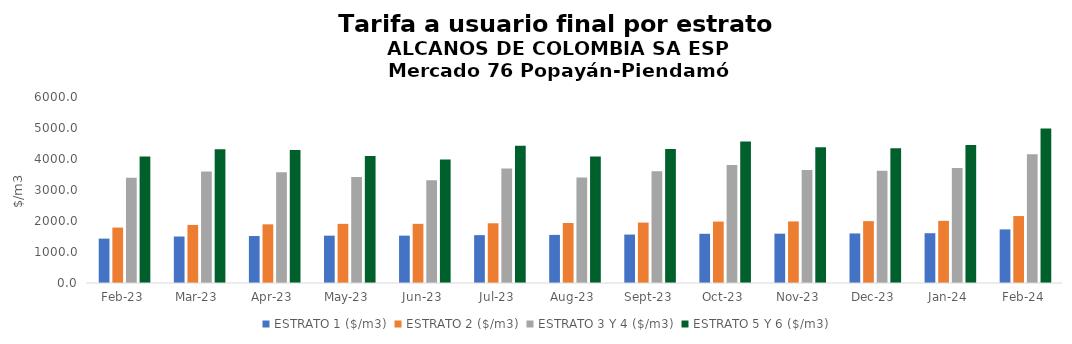
| Category | ESTRATO 1 ($/m3) | ESTRATO 2 ($/m3) | ESTRATO 3 Y 4 ($/m3) | ESTRATO 5 Y 6 ($/m3) |
|---|---|---|---|---|
| 2023-02-01 | 1431.45 | 1787.62 | 3398.26 | 4077.912 |
| 2023-03-01 | 1499.4 | 1873.1 | 3596.1 | 4315.32 |
| 2023-04-01 | 1515.22 | 1892.7 | 3575.22 | 4290.264 |
| 2023-05-01 | 1527.06 | 1907.55 | 3416.65 | 4099.98 |
| 2023-06-01 | 1528.08 | 1909 | 3316.57 | 3979.884 |
| 2023-07-01 | 1543.84 | 1926.61 | 3689.81 | 4427.772 |
| 2023-08-01 | 1551.43 | 1936.32 | 3401.48 | 4081.776 |
| 2023-09-01 | 1562.51 | 1949.77 | 3603.59 | 4324.308 |
| 2023-10-01 | 1587.1 | 1981.56 | 3805.44 | 4566.528 |
| 2023-11-01 | 1591.15 | 1986.35 | 3648.51 | 4378.212 |
| 2023-12-01 | 1598.38 | 1995.68 | 3624.28 | 4349.136 |
| 2024-01-01 | 1605.97 | 2004.9 | 3712.73 | 4455.276 |
| 2024-02-01 | 1728.92 | 2159.55 | 4149.96 | 4979.952 |